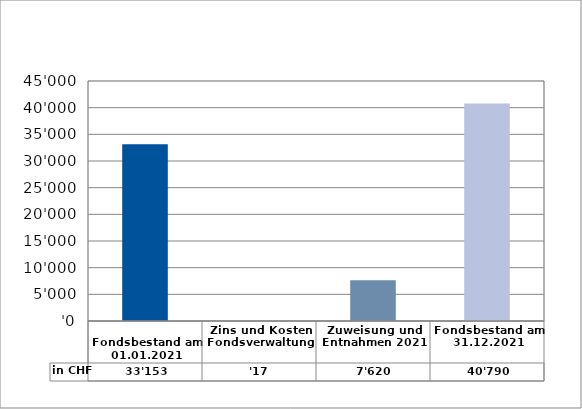
| Category | in CHF |
|---|---|
| 
Fondsbestand am 01.01.2021

 | 33153 |
| Zins und Kosten Fondsverwaltung | 16.6 |
| Zuweisung und Entnahmen 2021 | 7619.9 |
| Fondsbestand am 31.12.2021 | 40789.5 |